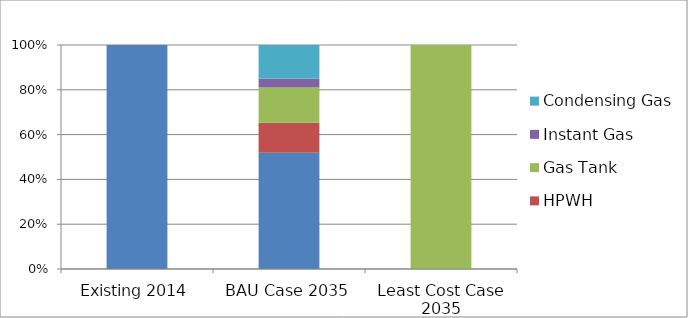
| Category | Electric Resistance | HPWH | Gas Tank | Instant Gas | Condensing Gas |
|---|---|---|---|---|---|
| Existing 2014 | 1 | 0 | 0 | 0 | 0 |
| BAU Case 2035 | 0.519 | 0.133 | 0.158 | 0.04 | 0.15 |
| Least Cost Case 2035 | 0 | 0 | 1 | 0 | 0 |